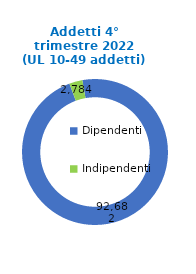
| Category | Series 0 |
|---|---|
| Dipendenti | 92682 |
| Indipendenti | 2784 |